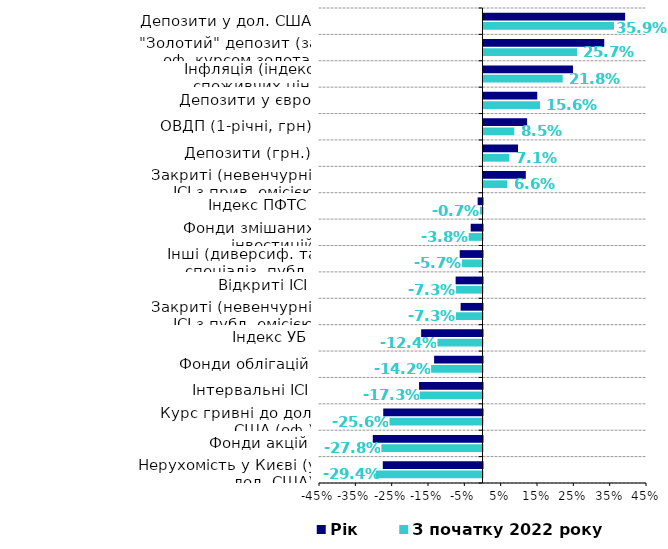
| Category | З початку 2022 року | Рік |
|---|---|---|
| Нерухомість у Києві (у дол. США) | -0.294 | -0.274 |
| Фонди акцій | -0.278 | -0.302 |
| Курс гривні до дол. США (оф.) | -0.256 | -0.273 |
| Інтервальні ІСІ | -0.173 | -0.175 |
| Фонди облігацій | -0.142 | -0.133 |
| Індекс УБ | -0.124 | -0.169 |
| Закриті (невенчурні) ІСІ з публ. емісією | -0.073 | -0.06 |
| Відкриті ІСІ | -0.073 | -0.074 |
| Інші (диверсиф. та спеціаліз. публ.) фонди | -0.057 | -0.063 |
| Фонди змішаних інвестицій | -0.038 | -0.033 |
| Індекс ПФТС | -0.007 | -0.013 |
| Закриті (невенчурні) ІСІ з прив. емісією | 0.066 | 0.116 |
| Депозити (грн.) | 0.071 | 0.095 |
| ОВДП (1-річні, грн) | 0.085 | 0.12 |
| Депозити у євро | 0.156 | 0.148 |
| Інфляція (індекс споживчих цін) | 0.218 | 0.246 |
| "Золотий" депозит (за оф. курсом золота) | 0.257 | 0.332 |
| Депозити у дол. США | 0.359 | 0.39 |